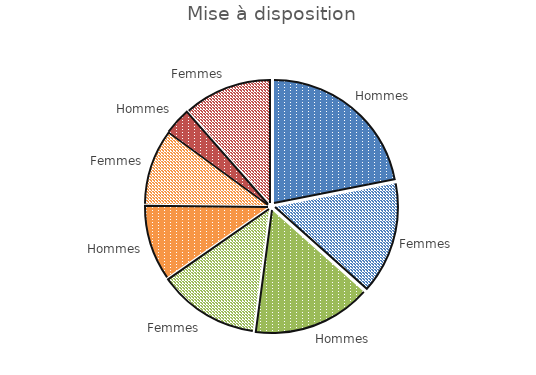
| Category | Mise à disposition |
|---|---|
| 0 | 21.917 |
| 1 | 14.67 |
| 2 | 15.517 |
| 3 | 13.209 |
| 4 | 9.848 |
| 5 | 9.877 |
| 6 | 3.477 |
| 7 | 11.485 |